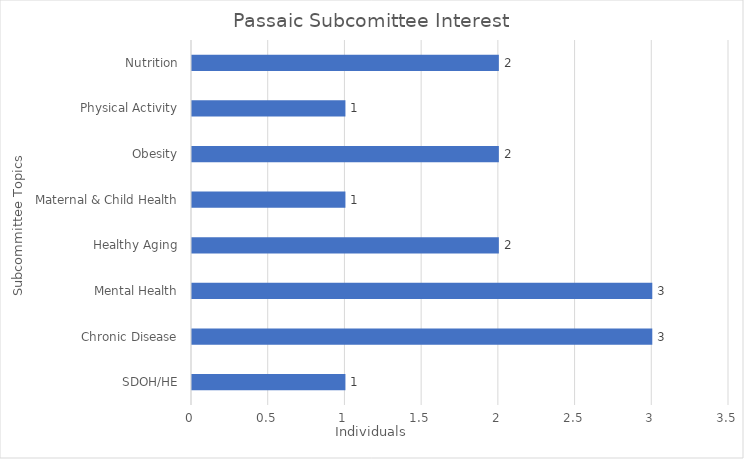
| Category | Series 0 |
|---|---|
| SDOH/HE | 1 |
| Chronic Disease | 3 |
| Mental Health | 3 |
| Healthy Aging | 2 |
| Maternal & Child Health | 1 |
| Obesity | 2 |
| Physical Activity | 1 |
| Nutrition | 2 |